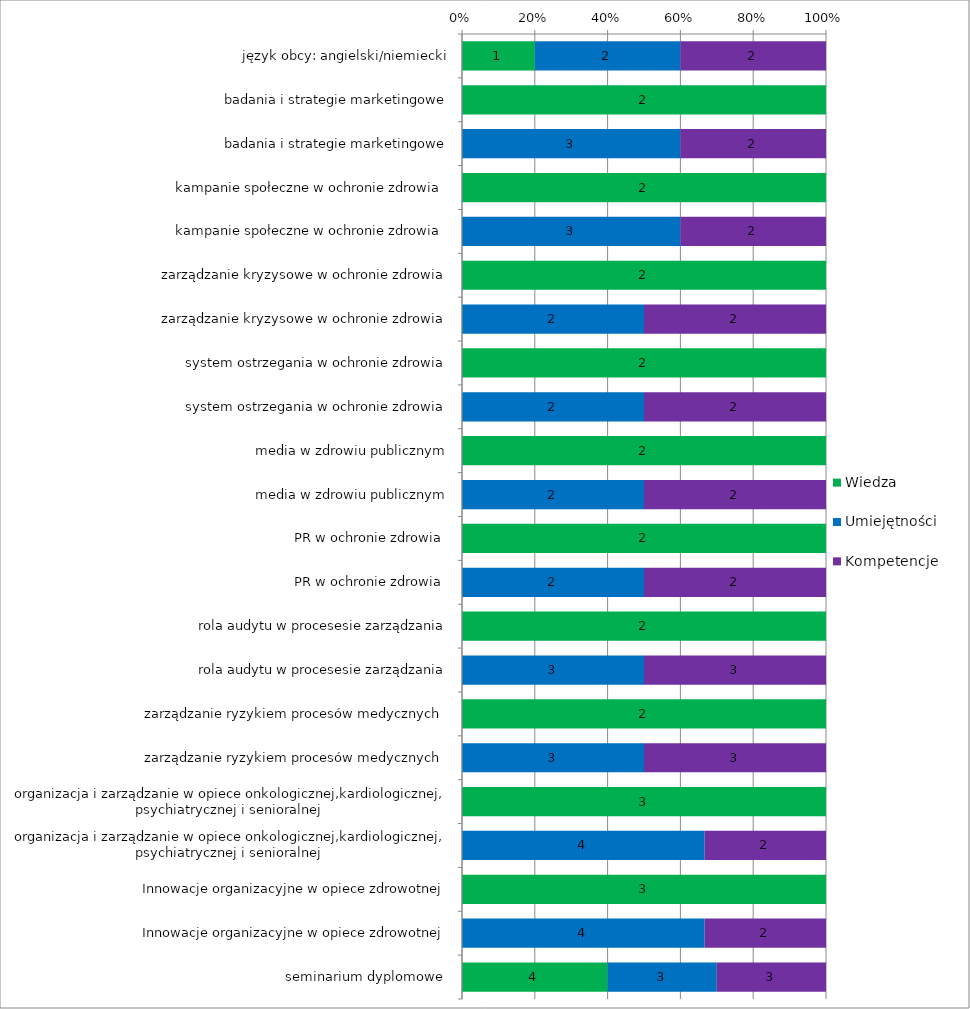
| Category | Wiedza | Umiejętności | Kompetencje |
|---|---|---|---|
| język obcy: angielski/niemiecki | 1 | 2 | 2 |
| badania i strategie marketingowe | 2 | 0 | 0 |
| badania i strategie marketingowe | 0 | 3 | 2 |
| kampanie społeczne w ochronie zdrowia  | 2 | 0 | 0 |
| kampanie społeczne w ochronie zdrowia  | 0 | 3 | 2 |
| zarządzanie kryzysowe w ochronie zdrowia | 2 | 0 | 0 |
| zarządzanie kryzysowe w ochronie zdrowia | 0 | 2 | 2 |
| system ostrzegania w ochronie zdrowia | 2 | 0 | 0 |
| system ostrzegania w ochronie zdrowia | 0 | 2 | 2 |
| media w zdrowiu publicznym | 2 | 0 | 0 |
| media w zdrowiu publicznym | 0 | 2 | 2 |
| PR w ochronie zdrowia  | 2 | 0 | 0 |
| PR w ochronie zdrowia  | 0 | 2 | 2 |
| rola audytu w procesesie zarządzania | 2 | 0 | 0 |
| rola audytu w procesesie zarządzania | 0 | 3 | 3 |
| zarządzanie ryzykiem procesów medycznych  | 2 | 0 | 0 |
| zarządzanie ryzykiem procesów medycznych  | 0 | 3 | 3 |
| organizacja i zarządzanie w opiece onkologicznej,kardiologicznej, psychiatrycznej i senioralnej  | 3 | 0 | 0 |
| organizacja i zarządzanie w opiece onkologicznej,kardiologicznej, psychiatrycznej i senioralnej  | 0 | 4 | 2 |
| Innowacje organizacyjne w opiece zdrowotnej | 3 | 0 | 0 |
| Innowacje organizacyjne w opiece zdrowotnej | 0 | 4 | 2 |
| seminarium dyplomowe  | 4 | 3 | 3 |